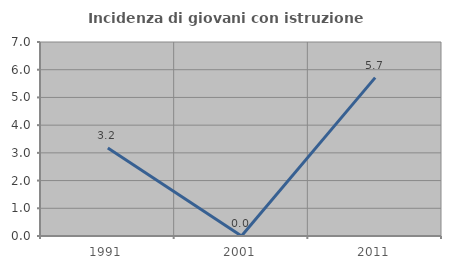
| Category | Incidenza di giovani con istruzione universitaria |
|---|---|
| 1991.0 | 3.175 |
| 2001.0 | 0 |
| 2011.0 | 5.714 |